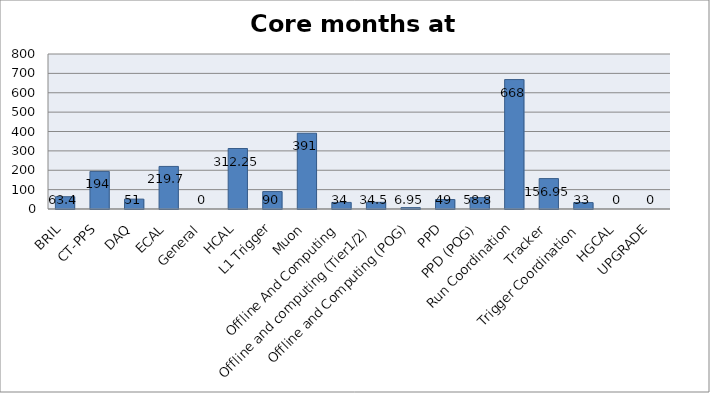
| Category | Series 0 |
|---|---|
| BRIL | 63.4 |
| CT-PPS | 194 |
| DAQ | 51 |
| ECAL | 219.7 |
| General | 0 |
| HCAL | 312.25 |
| L1 Trigger | 90 |
| Muon | 391 |
| Offline And Computing | 34 |
| Offline and computing (Tier1/2) | 34.5 |
| Offline and Computing (POG) | 6.95 |
| PPD | 49 |
| PPD (POG) | 58.8 |
| Run Coordination | 668 |
| Tracker | 156.95 |
| Trigger Coordination | 33 |
| HGCAL | 0 |
| UPGRADE | 0 |